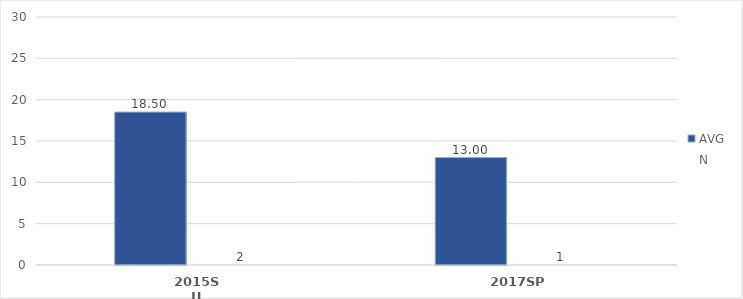
| Category | AVG | N |
|---|---|---|
| 2015SU | 18.5 | 2 |
| 2017SP | 13 | 1 |